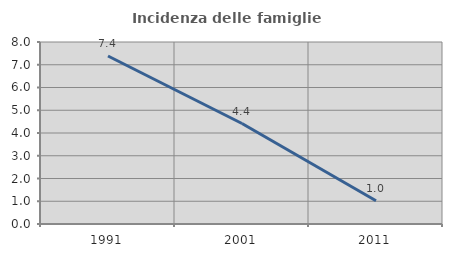
| Category | Incidenza delle famiglie numerose |
|---|---|
| 1991.0 | 7.384 |
| 2001.0 | 4.416 |
| 2011.0 | 1.023 |